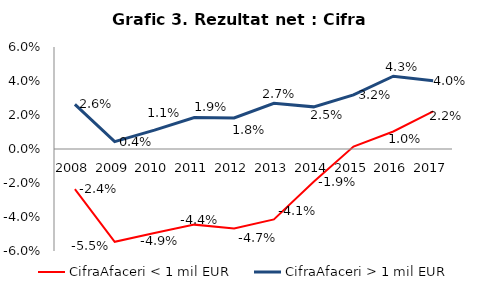
| Category | CifraAfaceri < 1 mil EUR | CifraAfaceri > 1 mil EUR |
|---|---|---|
| 2008.0 | -0.024 | 0.026 |
| 2009.0 | -0.055 | 0.004 |
| 2010.0 | -0.049 | 0.011 |
| 2011.0 | -0.044 | 0.019 |
| 2012.0 | -0.047 | 0.018 |
| 2013.0 | -0.041 | 0.027 |
| 2014.0 | -0.019 | 0.025 |
| 2015.0 | 0.001 | 0.032 |
| 2016.0 | 0.01 | 0.043 |
| 2017.0 | 0.022 | 0.04 |